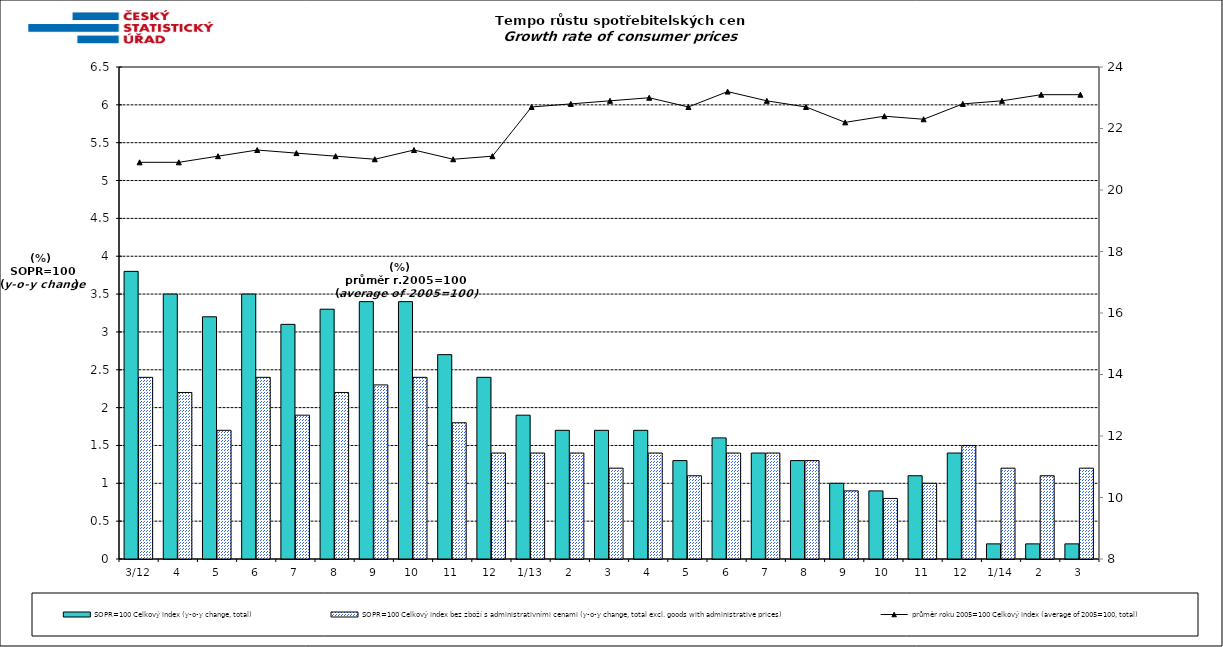
| Category | SOPR=100 Celkový index (y-o-y change, total) | SOPR=100 Celkový index bez zboží s administrativními cenami (y-o-y change, total excl. goods with administrative prices)  |
|---|---|---|
| 3/12 | 3.8 | 2.4 |
| 4 | 3.5 | 2.2 |
| 5 | 3.2 | 1.7 |
| 6 | 3.5 | 2.4 |
| 7 | 3.1 | 1.9 |
| 8 | 3.3 | 2.2 |
| 9 | 3.4 | 2.3 |
| 10 | 3.4 | 2.4 |
| 11 | 2.7 | 1.8 |
| 12 | 2.4 | 1.4 |
| 1/13 | 1.9 | 1.4 |
| 2 | 1.7 | 1.4 |
| 3 | 1.7 | 1.2 |
| 4 | 1.7 | 1.4 |
| 5 | 1.3 | 1.1 |
| 6 | 1.6 | 1.4 |
| 7 | 1.4 | 1.4 |
| 8 | 1.3 | 1.3 |
| 9 | 1 | 0.9 |
| 10 | 0.9 | 0.8 |
| 11 | 1.1 | 1 |
| 12 | 1.4 | 1.5 |
| 1/14 | 0.2 | 1.2 |
| 2 | 0.2 | 1.1 |
| 3 | 0.2 | 1.2 |